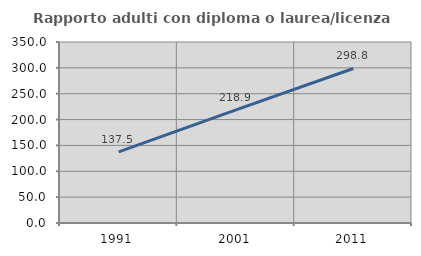
| Category | Rapporto adulti con diploma o laurea/licenza media  |
|---|---|
| 1991.0 | 137.549 |
| 2001.0 | 218.879 |
| 2011.0 | 298.814 |